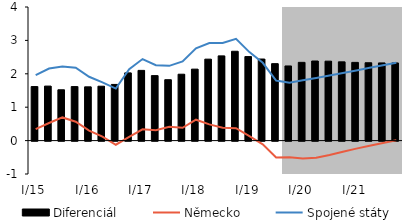
| Category | Diferenciál |
|---|---|
| 0 | 1.618 |
| 1 | 1.632 |
| 2 | 1.522 |
| 3 | 1.617 |
| 4 | 1.61 |
| 5 | 1.629 |
| 6 | 1.682 |
| 7 | 2.027 |
| 8 | 2.102 |
| 9 | 1.946 |
| 10 | 1.823 |
| 11 | 1.988 |
| 12 | 2.14 |
| 13 | 2.439 |
| 14 | 2.536 |
| 15 | 2.675 |
| 16 | 2.516 |
| 17 | 2.442 |
| 18 | 2.304 |
| 19 | 2.235 |
| 20 | 2.343 |
| 21 | 2.383 |
| 22 | 2.378 |
| 23 | 2.358 |
| 24 | 2.342 |
| 25 | 2.331 |
| 26 | 2.326 |
| 27 | 2.325 |